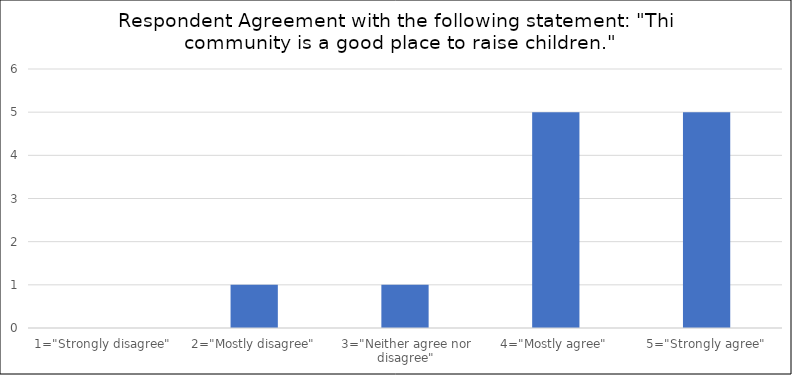
| Category | Number of Responses |
|---|---|
| 1="Strongly disagree" | 0 |
| 2="Mostly disagree" | 1 |
| 3="Neither agree nor disagree" | 1 |
| 4="Mostly agree" | 5 |
| 5="Strongly agree" | 5 |